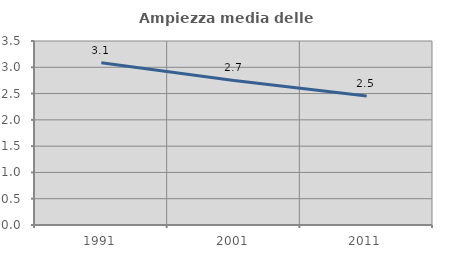
| Category | Ampiezza media delle famiglie |
|---|---|
| 1991.0 | 3.085 |
| 2001.0 | 2.749 |
| 2011.0 | 2.452 |